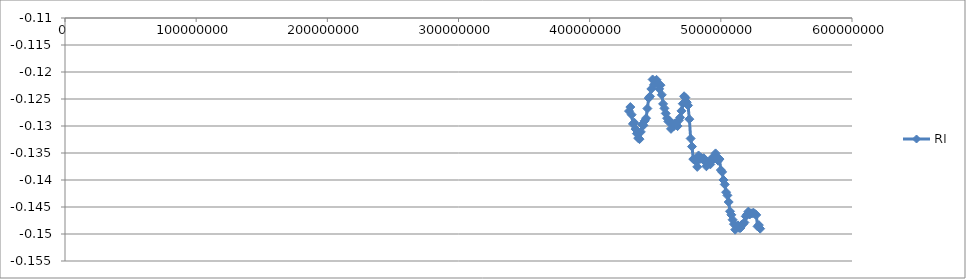
| Category | RI |
|---|---|
| 430000000.0 | -0.127 |
| 431000000.0 | -0.126 |
| 432000000.0 | -0.128 |
| 433000000.0 | -0.13 |
| 434000000.0 | -0.129 |
| 435000000.0 | -0.131 |
| 436000000.0 | -0.131 |
| 437000000.0 | -0.132 |
| 438000000.0 | -0.132 |
| 439000000.0 | -0.131 |
| 440000000.0 | -0.13 |
| 441000000.0 | -0.13 |
| 442000000.0 | -0.129 |
| 443000000.0 | -0.129 |
| 444000000.0 | -0.127 |
| 445000000.0 | -0.125 |
| 446000000.0 | -0.125 |
| 447000000.0 | -0.123 |
| 448000000.0 | -0.121 |
| 449000000.0 | -0.122 |
| 450000000.0 | -0.122 |
| 451000000.0 | -0.121 |
| 452000000.0 | -0.122 |
| 453000000.0 | -0.123 |
| 454000000.0 | -0.122 |
| 455000000.0 | -0.124 |
| 456000000.0 | -0.126 |
| 457000000.0 | -0.127 |
| 458000000.0 | -0.128 |
| 459000000.0 | -0.129 |
| 460000000.0 | -0.129 |
| 461000000.0 | -0.129 |
| 462000000.0 | -0.131 |
| 463000000.0 | -0.13 |
| 464000000.0 | -0.13 |
| 465000000.0 | -0.13 |
| 466000000.0 | -0.129 |
| 467000000.0 | -0.13 |
| 468000000.0 | -0.129 |
| 469000000.0 | -0.128 |
| 470000000.0 | -0.127 |
| 471000000.0 | -0.126 |
| 472000000.0 | -0.124 |
| 473000000.0 | -0.125 |
| 474000000.0 | -0.126 |
| 475000000.0 | -0.126 |
| 476000000.0 | -0.129 |
| 477000000.0 | -0.132 |
| 478000000.0 | -0.134 |
| 479000000.0 | -0.136 |
| 480000000.0 | -0.136 |
| 481000000.0 | -0.136 |
| 482000000.0 | -0.138 |
| 483000000.0 | -0.135 |
| 484000000.0 | -0.136 |
| 485000000.0 | -0.136 |
| 486000000.0 | -0.136 |
| 487000000.0 | -0.136 |
| 488000000.0 | -0.137 |
| 489000000.0 | -0.137 |
| 490000000.0 | -0.137 |
| 491000000.0 | -0.137 |
| 492000000.0 | -0.137 |
| 493000000.0 | -0.136 |
| 494000000.0 | -0.136 |
| 495000000.0 | -0.136 |
| 496000000.0 | -0.135 |
| 497000000.0 | -0.136 |
| 498000000.0 | -0.136 |
| 499000000.0 | -0.136 |
| 500000000.0 | -0.138 |
| 501000000.0 | -0.139 |
| 502000000.0 | -0.14 |
| 503000000.0 | -0.141 |
| 504000000.0 | -0.142 |
| 505000000.0 | -0.143 |
| 506000000.0 | -0.144 |
| 507000000.0 | -0.146 |
| 508000000.0 | -0.146 |
| 509000000.0 | -0.147 |
| 510000000.0 | -0.148 |
| 511000000.0 | -0.149 |
| 512000000.0 | -0.149 |
| 513000000.0 | -0.148 |
| 514000000.0 | -0.149 |
| 515000000.0 | -0.149 |
| 516000000.0 | -0.148 |
| 517000000.0 | -0.148 |
| 518000000.0 | -0.148 |
| 519000000.0 | -0.147 |
| 520000000.0 | -0.146 |
| 521000000.0 | -0.146 |
| 522000000.0 | -0.146 |
| 523000000.0 | -0.146 |
| 524000000.0 | -0.146 |
| 525000000.0 | -0.146 |
| 526000000.0 | -0.146 |
| 527000000.0 | -0.146 |
| 528000000.0 | -0.149 |
| 529000000.0 | -0.148 |
| 530000000.0 | -0.149 |